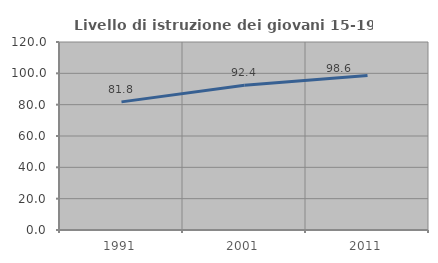
| Category | Livello di istruzione dei giovani 15-19 anni |
|---|---|
| 1991.0 | 81.783 |
| 2001.0 | 92.373 |
| 2011.0 | 98.561 |